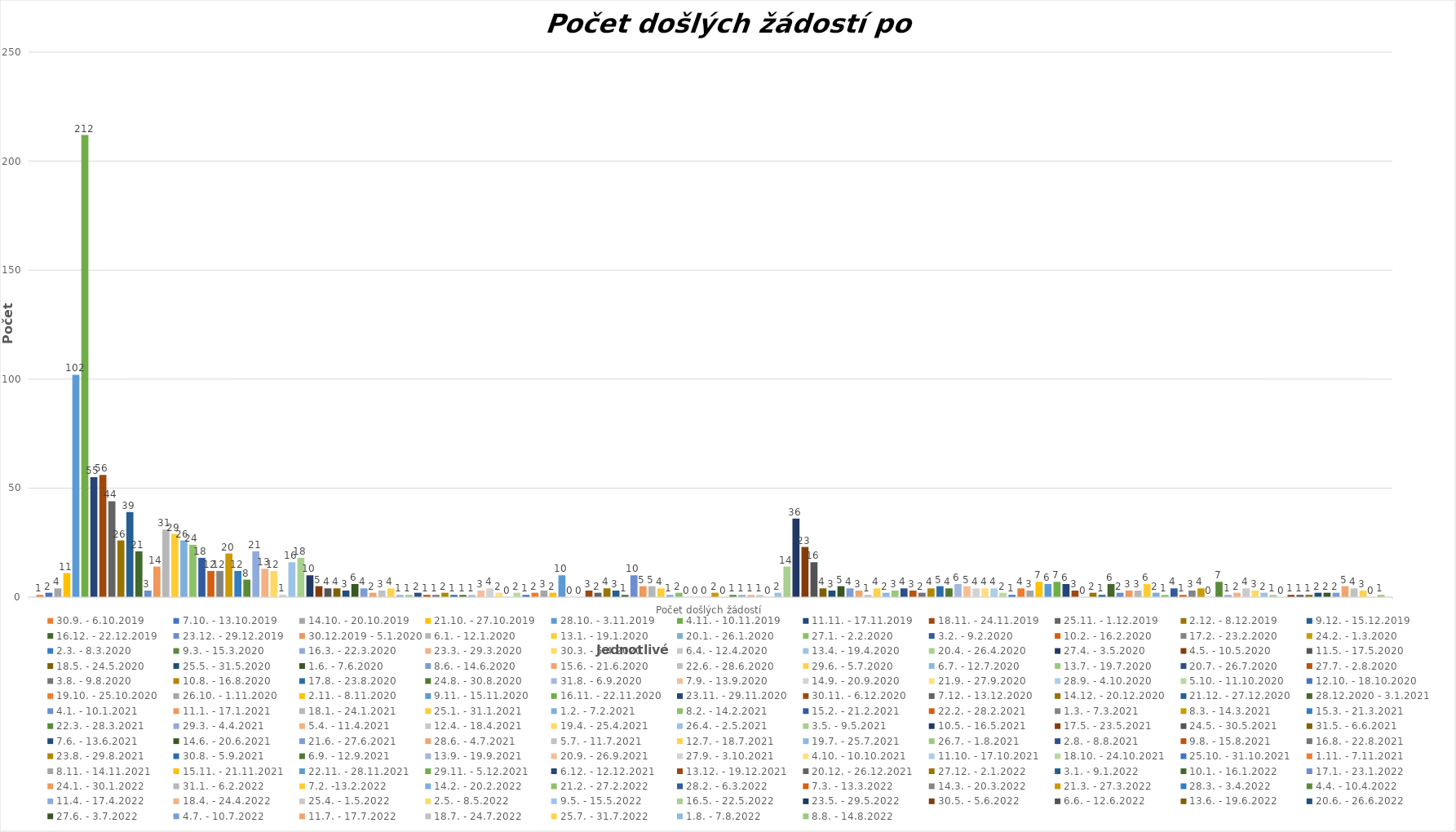
| Category | 30.9. - 6.10.2019 | 7.10. - 13.10.2019 | 14.10. - 20.10.2019 | 21.10. - 27.10.2019 | 28.10. - 3.11.2019 | 4.11. - 10.11.2019 | 11.11. - 17.11.2019 | 18.11. - 24.11.2019 | 25.11. - 1.12.2019 | 2.12. - 8.12.2019 | 9.12. - 15.12.2019 | 16.12. - 22.12.2019 | 23.12. - 29.12.2019 | 30.12.2019 - 5.1.2020 | 6.1. - 12.1.2020 | 13.1. - 19.1.2020 | 20.1. - 26.1.2020 | 27.1. - 2.2.2020 | 3.2. - 9.2.2020 | 10.2. - 16.2.2020 | 17.2. - 23.2.2020 | 24.2. - 1.3.2020 | 2.3. - 8.3.2020 | 9.3. - 15.3.2020 | 16.3. - 22.3.2020 | 23.3. - 29.3.2020 | 30.3. - 5.4.2020 | 6.4. - 12.4.2020 | 13.4. - 19.4.2020 | 20.4. - 26.4.2020 | 27.4. - 3.5.2020 | 4.5. - 10.5.2020 | 11.5. - 17.5.2020 | 18.5. - 24.5.2020 | 25.5. - 31.5.2020 | 1.6. - 7.6.2020 | 8.6. - 14.6.2020 | 15.6. - 21.6.2020 | 22.6. - 28.6.2020 | 29.6. - 5.7.2020 | 6.7. - 12.7.2020 | 13.7. - 19.7.2020 | 20.7. - 26.7.2020 | 27.7. - 2.8.2020 | 3.8. - 9.8.2020 | 10.8. - 16.8.2020 | 17.8. - 23.8.2020 | 24.8. - 30.8.2020 | 31.8. - 6.9.2020 | 7.9. - 13.9.2020 | 14.9. - 20.9.2020 | 21.9. - 27.9.2020 | 28.9. - 4.10.2020 | 5.10. - 11.10.2020 | 12.10. - 18.10.2020 | 19.10. - 25.10.2020 | 26.10. - 1.11.2020 | 2.11. - 8.11.2020 | 9.11. - 15.11.2020 | 16.11. - 22.11.2020 | 23.11. - 29.11.2020 | 30.11. - 6.12.2020 | 7.12. - 13.12.2020 | 14.12. - 20.12.2020 | 21.12. - 27.12.2020 | 28.12.2020 - 3.1.2021 | 4.1. - 10.1.2021 | 11.1. - 17.1.2021 | 18.1. - 24.1.2021 | 25.1. - 31.1.2021 | 1.2. - 7.2.2021 | 8.2. - 14.2.2021 | 15.2. - 21.2.2021 | 22.2. - 28.2.2021 | 1.3. - 7.3.2021 | 8.3. - 14.3.2021 | 15.3. - 21.3.2021 | 22.3. - 28.3.2021 | 29.3. - 4.4.2021 | 5.4. - 11.4.2021 | 12.4. - 18.4.2021 | 19.4. - 25.4.2021 | 26.4. - 2.5.2021 | 3.5. - 9.5.2021 | 10.5. - 16.5.2021 | 17.5. - 23.5.2021 | 24.5. - 30.5.2021 | 31.5. - 6.6.2021 | 7.6. - 13.6.2021 | 14.6. - 20.6.2021 | 21.6. - 27.6.2021 | 28.6. - 4.7.2021 | 5.7. - 11.7.2021 | 12.7. - 18.7.2021 | 19.7. - 25.7.2021 | 26.7. - 1.8.2021 | 2.8. - 8.8.2021 | 9.8. - 15.8.2021 | 16.8. - 22.8.2021 | 23.8. - 29.8.2021 | 30.8. - 5.9.2021 | 6.9. - 12.9.2021 | 13.9. - 19.9.2021 | 20.9. - 26.9.2021 | 27.9. - 3.10.2021 | 4.10. - 10.10.2021 | 11.10. - 17.10.2021 | 18.10. - 24.10.2021 | 25.10. - 31.10.2021 | 1.11. - 7.11.2021 | 8.11. - 14.11.2021 | 15.11. - 21.11.2021 | 22.11. - 28.11.2021 | 29.11. - 5.12.2021 | 6.12. - 12.12.2021 | 13.12. - 19.12.2021 | 20.12. - 26.12.2021 | 27.12. - 2.1.2022 | 3.1. - 9.1.2022 | 10.1. - 16.1.2022 | 17.1. - 23.1.2022 | 24.1. - 30.1.2022 | 31.1. - 6.2.2022 | 7.2. -13.2.2022 | 14.2. - 20.2.2022 | 21.2. - 27.2.2022 | 28.2. - 6.3.2022 | 7.3. - 13.3.2022 | 14.3. - 20.3.2022 | 21.3. - 27.3.2022 | 28.3. - 3.4.2022 | 4.4. - 10.4.2022 | 11.4. - 17.4.2022 | 18.4. - 24.4.2022 | 25.4. - 1.5.2022 | 2.5. - 8.5.2022 | 9.5. - 15.5.2022 | 16.5. - 22.5.2022 | 23.5. - 29.5.2022 | 30.5. - 5.6.2022 | 6.6. - 12.6.2022 | 13.6. - 19.6.2022 | 20.6. - 26.6.2022 | 27.6. - 3.7.2022 | 4.7. - 10.7.2022 | 11.7. - 17.7.2022 | 18.7. - 24.7.2022 | 25.7. - 31.7.2022 | 1.8. - 7.8.2022 | 8.8. - 14.8.2022 |
|---|---|---|---|---|---|---|---|---|---|---|---|---|---|---|---|---|---|---|---|---|---|---|---|---|---|---|---|---|---|---|---|---|---|---|---|---|---|---|---|---|---|---|---|---|---|---|---|---|---|---|---|---|---|---|---|---|---|---|---|---|---|---|---|---|---|---|---|---|---|---|---|---|---|---|---|---|---|---|---|---|---|---|---|---|---|---|---|---|---|---|---|---|---|---|---|---|---|---|---|---|---|---|---|---|---|---|---|---|---|---|---|---|---|---|---|---|---|---|---|---|---|---|---|---|---|---|---|---|---|---|---|---|---|---|---|---|---|---|---|---|---|---|---|---|---|---|---|---|---|---|
| Počet došlých žádostí | 1 | 2 | 4 | 11 | 102 | 212 | 55 | 56 | 44 | 26 | 39 | 21 | 3 | 14 | 31 | 29 | 26 | 24 | 18 | 12 | 12 | 20 | 12 | 8 | 21 | 13 | 12 | 1 | 16 | 18 | 10 | 5 | 4 | 4 | 3 | 6 | 4 | 2 | 3 | 4 | 1 | 1 | 2 | 1 | 1 | 2 | 1 | 1 | 1 | 3 | 4 | 2 | 0 | 2 | 1 | 2 | 3 | 2 | 10 | 0 | 0 | 3 | 2 | 4 | 3 | 1 | 10 | 5 | 5 | 4 | 1 | 2 | 0 | 0 | 0 | 2 | 0 | 1 | 1 | 1 | 1 | 0 | 2 | 14 | 36 | 23 | 16 | 4 | 3 | 5 | 4 | 3 | 1 | 4 | 2 | 3 | 4 | 3 | 2 | 4 | 5 | 4 | 6 | 5 | 4 | 4 | 4 | 2 | 1 | 4 | 3 | 7 | 6 | 7 | 6 | 3 | 0 | 2 | 1 | 6 | 2 | 3 | 3 | 6 | 2 | 1 | 4 | 1 | 3 | 4 | 0 | 7 | 1 | 2 | 4 | 3 | 2 | 1 | 0 | 1 | 1 | 1 | 2 | 2 | 2 | 5 | 4 | 3 | 0 | 1 |